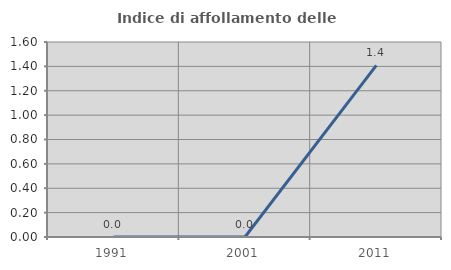
| Category | Indice di affollamento delle abitazioni  |
|---|---|
| 1991.0 | 0 |
| 2001.0 | 0 |
| 2011.0 | 1.408 |